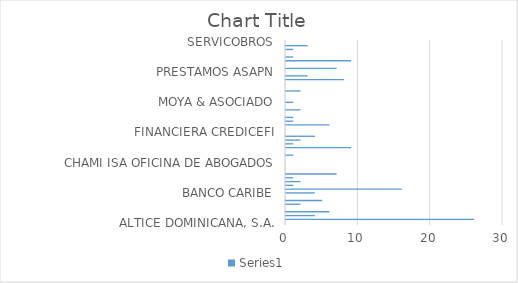
| Category | Series 0 |
|---|---|
| ALTICE DOMINICANA, S.A. | 0 |
| A & R CONSULTORES LEGALES | 26 |
| ASC. POPULAR DE AHORROS Y PRESTAMOS | 4 |
| ASEREMIN | 6 |
| AYUNTAMIENTO DEL DISTRITO NACIONAL, ADN | 0 |
| BALLISTA CONTRERAS & ASOCIADO | 2 |
| BANCO ADEMI | 5 |
| BANCO BHD LEON | 0 |
| BANCO CARIBE | 4 |
| BANCO POPULAR DOMINICANO | 16 |
| BANCO PROMERICA | 1 |
| BANCO SANTA CRUZ | 2 |
| BANESCO | 1 |
| BANRESERVAS | 7 |
| BAUGIL INVERSIONES Y PRÉSTAMOS, S.R.L. | 0 |
| CABRAL & DIAZ ASESORES LEGALES | 0 |
| CHAMI ISA OFICINA DE ABOGADOS | 0 |
| CLARO COMPANIA DOMINICANA DE TELEFONOS | 0 |
| COBEX. S.R.L. | 1 |
| COBROS LEGALES PEGUERO MATEO | 0 |
| COBROS NACIONALES | 9 |
| COLECTORES LEGALES | 1 |
| ESTUDIO LEGAL SOSA EVERTZ | 2 |
| FBGG SERVICIOS LEGALES | 4 |
| FINANCIERA CREDICEFI | 0 |
| GESTIONADORA DE CREDITOS NOVANET | 0 |
| GESTIONADORA DE CRÉDITOS, S. A. | 6 |
| GESTORA DE COBROS GUERRERO GIL Y ASOCIADOS | 1 |
| INVERSIONES 3R | 1 |
| INVERSIONES CROUSET | 0 |
| JULIÁN BRENES Y ASOCIADOS | 2 |
| L & R COMERCIAL SRL | 0 |
| MOYA & ASOCIADO | 1 |
| NO DEFINIDA | 0 |
| OFICINA DE ABOGADOS SOLUCIONES CARVAC | 0 |
| OLIVERO RODRIGUEZ Y ASOCIADOS | 2 |
| OTROS | 0 |
| PAREDES CUEVAS & ASOCIADOS | 0 |
| PC&N ACCESO LEGAL | 8 |
| PLUS LEGAL, S.R.L. | 3 |
| PRESTAMOS ASAPN | 0 |
| PROFESIONALES, S.R.L | 7 |
| QUANTUS, S. A. | 0 |
| RE PLASENCIA & ASOCIADOS | 9 |
| RENASSANCE CONSULTANTS, SRL | 1 |
| REYNOSO CONTRERA & ASOCIADO | 0 |
| REYNOSO RIVERA & ASOCIADOS | 1 |
| SCOTIABANK | 3 |
| SERVICOBROS | 0 |